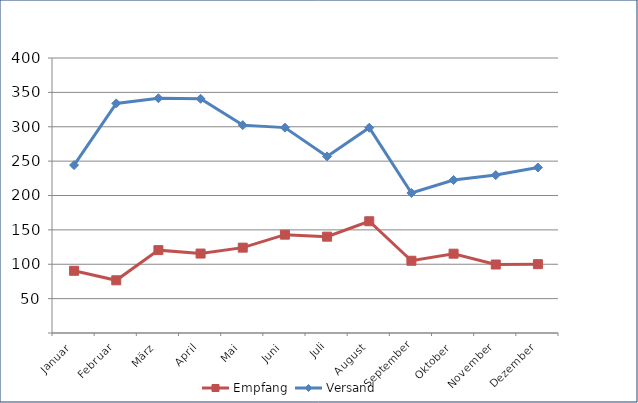
| Category | Empfang | Versand |
|---|---|---|
| Januar | 90.486 | 244.19 |
| Februar | 76.676 | 333.929 |
| März | 120.534 | 341.445 |
| April | 115.564 | 340.62 |
| Mai | 124.15 | 302.35 |
| Juni | 143.051 | 298.739 |
| Juli | 140.119 | 256.831 |
| August | 162.523 | 298.577 |
| September | 105.079 | 203.665 |
| Oktober | 115.36 | 222.558 |
| November | 99.612 | 229.675 |
| Dezember | 100.135 | 240.771 |